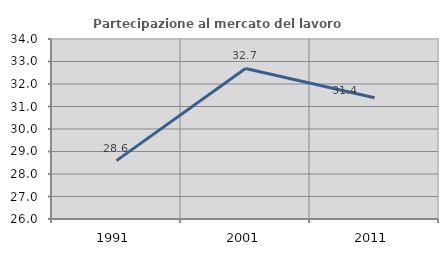
| Category | Partecipazione al mercato del lavoro  femminile |
|---|---|
| 1991.0 | 28.594 |
| 2001.0 | 32.689 |
| 2011.0 | 31.387 |